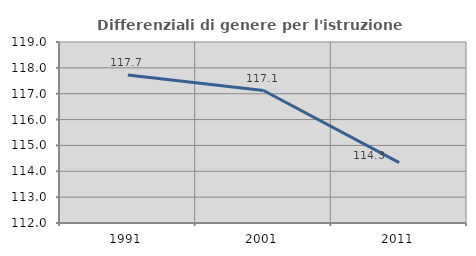
| Category | Differenziali di genere per l'istruzione superiore |
|---|---|
| 1991.0 | 117.728 |
| 2001.0 | 117.124 |
| 2011.0 | 114.333 |